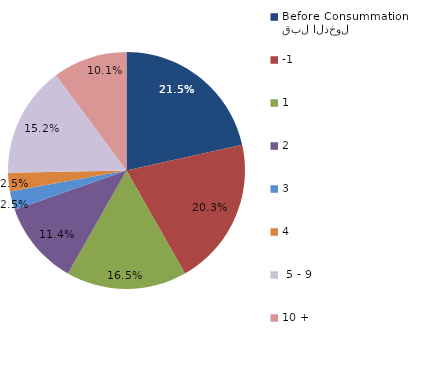
| Category | Series 0 |
|---|---|
| قبل الدخول
Before Consummation | 21.519 |
| -1 | 20.253 |
| 1 | 16.456 |
| 2 | 11.392 |
| 3 | 2.532 |
| 4 | 2.532 |
|  5 - 9 | 15.19 |
| 10 + | 10.127 |